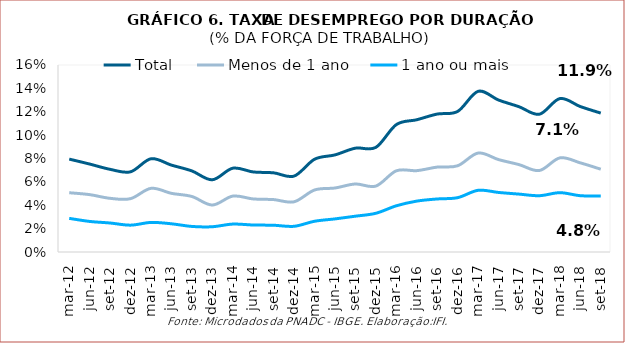
| Category | Total | Menos de 1 ano | 1 ano ou mais |
|---|---|---|---|
| mar-12 | 0.079 | 0.051 | 0.029 |
| jun-12 | 0.075 | 0.049 | 0.026 |
| set-12 | 0.071 | 0.046 | 0.025 |
| dez-12 | 0.069 | 0.046 | 0.023 |
| mar-13 | 0.08 | 0.054 | 0.025 |
| jun-13 | 0.074 | 0.05 | 0.024 |
| set-13 | 0.069 | 0.047 | 0.022 |
| dez-13 | 0.062 | 0.04 | 0.022 |
| mar-14 | 0.072 | 0.048 | 0.024 |
| jun-14 | 0.068 | 0.045 | 0.023 |
| set-14 | 0.068 | 0.045 | 0.023 |
| dez-14 | 0.065 | 0.043 | 0.022 |
| mar-15 | 0.079 | 0.053 | 0.026 |
| jun-15 | 0.083 | 0.055 | 0.028 |
| set-15 | 0.089 | 0.058 | 0.031 |
| dez-15 | 0.09 | 0.056 | 0.033 |
| mar-16 | 0.109 | 0.069 | 0.04 |
| jun-16 | 0.113 | 0.07 | 0.044 |
| set-16 | 0.118 | 0.073 | 0.045 |
| dez-16 | 0.12 | 0.074 | 0.046 |
| mar-17 | 0.137 | 0.085 | 0.053 |
| jun-17 | 0.13 | 0.079 | 0.051 |
| set-17 | 0.124 | 0.075 | 0.05 |
| dez-17 | 0.118 | 0.07 | 0.048 |
| mar-18 | 0.131 | 0.081 | 0.051 |
| jun-18 | 0.124 | 0.076 | 0.048 |
| set-18 | 0.119 | 0.071 | 0.048 |